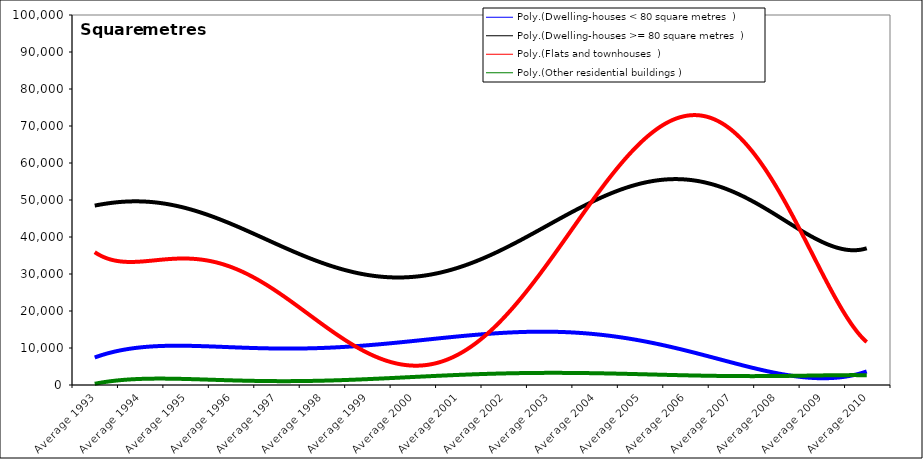
| Category | Dwelling-houses < 80 square metres | Dwelling-houses >= 80 square metres | Flats and townhouses | Other residential buildings |
|---|---|---|---|---|
| Average 1993 | 8362.833 | 49150.667 | 36251.333 | 749 |
| Average 1994 | 8597.75 | 46004 | 30730.25 | 976.667 |
| Average 1995 | 9236.167 | 53843.667 | 40228.083 | 564.083 |
| Average 1996 | 12336.083 | 42175.083 | 27082.333 | 2702.5 |
| Average 1997 | 10219.25 | 33807.833 | 26253.917 | 2061.583 |
| Average 1998 | 10805.667 | 35337.083 | 14789.5 | 1157.583 |
| Average 1999 | 13502.667 | 28354.25 | 8151 | 568.25 |
| Average 2000 | 8646.667 | 33005.417 | 9747 | 1034.333 |
| Average 2001 | 8365.917 | 29737.917 | 10102.917 | 1691.667 |
| Average 2002 | 7953.167 | 36527.083 | 15495.667 | 5879.333 |
| Average 2003 | 29804.667 | 43954.917 | 29153.917 | 2207.167 |
| Average 2004 | 13668.167 | 50620.5 | 43213.25 | 5505.417 |
| Average 2005 | 9015.167 | 51747.583 | 86738.583 | 853.833 |
| Average 2006 | 5352.833 | 56357.083 | 62931.5 | 2518.083 |
| Average 2007 | 5147.25 | 51162.917 | 62257.333 | 2044.333 |
| Average 2008 | 5934.583 | 51678.5 | 61256.083 | 2785.167 |
| Average 2009 | 2800.333 | 33403.75 | 27874.833 | 3131.667 |
| Average 2010 | 2801.857 | 38464.857 | 11753.429 | 2325.714 |